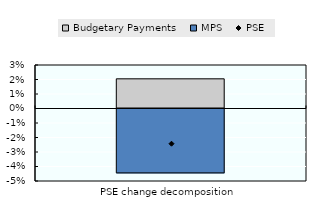
| Category | Budgetary Payments | MPS |
|---|---|---|
| PSE change decomposition | 0.02 | -0.045 |